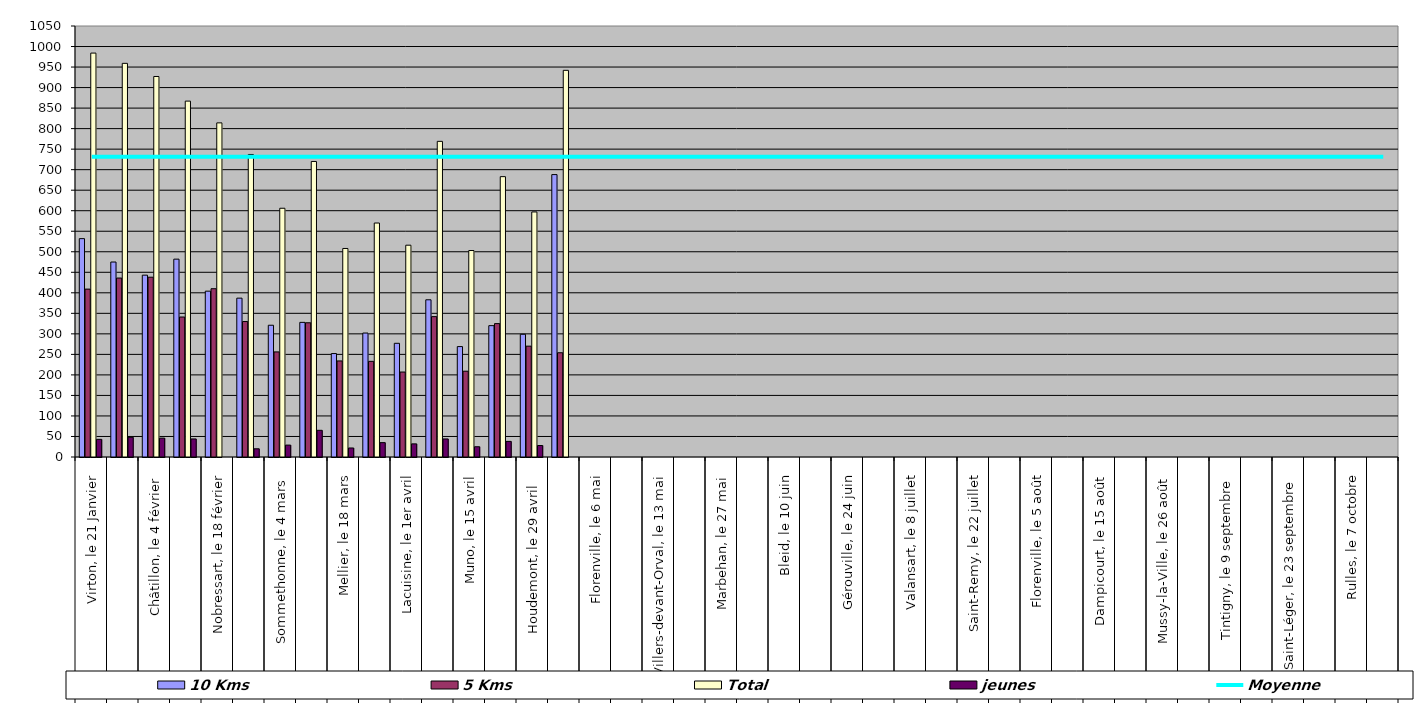
| Category | 10 Kms | 5 Kms | Total | jeunes |
|---|---|---|---|---|
| 0 | 532 | 409 | 984 | 43 |
| 1 | 475 | 436 | 959 | 48 |
| 2 | 443 | 438 | 927 | 46 |
| 3 | 482 | 341 | 867 | 44 |
| 4 | 404 | 410 | 814 | 0 |
| 5 | 387 | 330 | 737 | 20 |
| 6 | 321 | 256 | 606 | 29 |
| 7 | 328 | 327 | 720 | 65 |
| 8 | 252 | 234 | 508 | 22 |
| 9 | 302 | 233 | 570 | 35 |
| 10 | 277 | 207 | 516 | 32 |
| 11 | 383 | 342 | 769 | 44 |
| 12 | 269 | 209 | 503 | 25 |
| 13 | 320 | 325 | 683 | 38 |
| 14 | 299 | 270 | 597 | 28 |
| 15 | 688 | 254 | 942 | 0 |
| 16 | 0 | 0 | 0 | 0 |
| 17 | 0 | 0 | 0 | 0 |
| 18 | 0 | 0 | 0 | 0 |
| 19 | 0 | 0 | 0 | 0 |
| 20 | 0 | 0 | 0 | 0 |
| 21 | 0 | 0 | 0 | 0 |
| 22 | 0 | 0 | 0 | 0 |
| 23 | 0 | 0 | 0 | 0 |
| 24 | 0 | 0 | 0 | 0 |
| 25 | 0 | 0 | 0 | 0 |
| 26 | 0 | 0 | 0 | 0 |
| 27 | 0 | 0 | 0 | 0 |
| 28 | 0 | 0 | 0 | 0 |
| 29 | 0 | 0 | 0 | 0 |
| 30 | 0 | 0 | 0 | 0 |
| 31 | 0 | 0 | 0 | 0 |
| 32 | 0 | 0 | 0 | 0 |
| 33 | 0 | 0 | 0 | 0 |
| 34 | 0 | 0 | 0 | 0 |
| 35 | 0 | 0 | 0 | 0 |
| 36 | 0 | 0 | 0 | 0 |
| 37 | 0 | 0 | 0 | 0 |
| 38 | 0 | 0 | 0 | 0 |
| 39 | 0 | 0 | 0 | 0 |
| 40 | 0 | 0 | 0 | 0 |
| 41 | 0 | 0 | 0 | 0 |